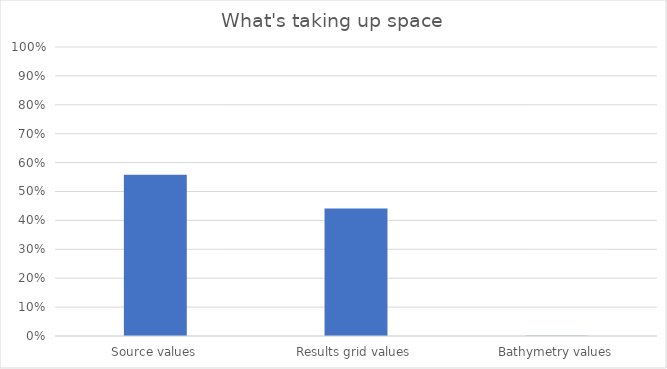
| Category | Series 0 |
|---|---|
| Source values | 0.558 |
| Results grid values | 0.441 |
| Bathymetry values | 0.001 |